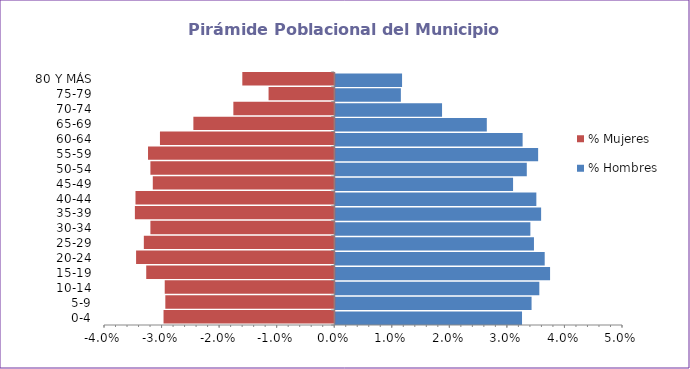
| Category | % Hombres | % Mujeres |
|---|---|---|
| 0-4 | 0.032 | -0.03 |
| 5-9 | 0.034 | -0.029 |
| 10-14 | 0.035 | -0.029 |
| 15-19 | 0.037 | -0.033 |
| 20-24 | 0.036 | -0.034 |
| 25-29 | 0.035 | -0.033 |
| 30-34 | 0.034 | -0.032 |
| 35-39 | 0.036 | -0.035 |
| 40-44 | 0.035 | -0.035 |
| 45-49 | 0.031 | -0.032 |
| 50-54 | 0.033 | -0.032 |
| 55-59 | 0.035 | -0.032 |
| 60-64 | 0.033 | -0.03 |
| 65-69 | 0.026 | -0.024 |
| 70-74 | 0.019 | -0.018 |
| 75-79 | 0.011 | -0.011 |
| 80 Y MÁS | 0.012 | -0.016 |